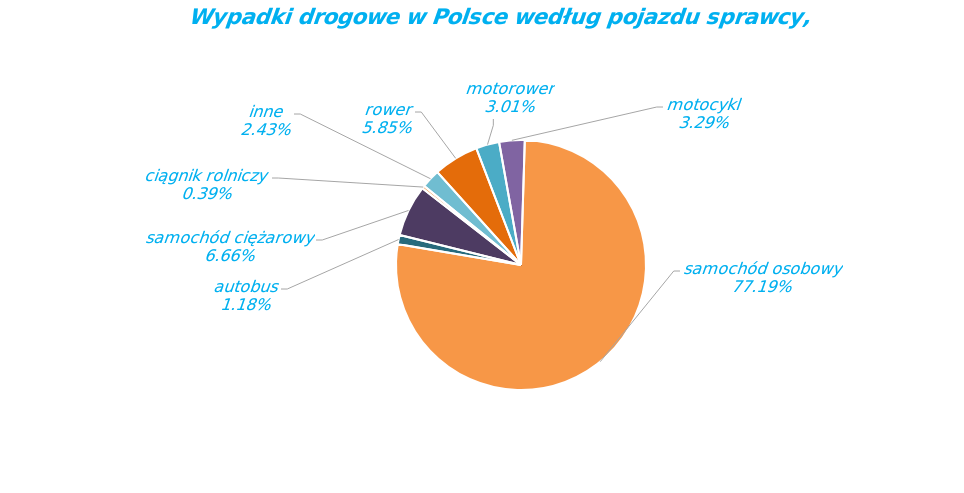
| Category | Series 0 |
|---|---|
| rower | 1716 |
| motorower | 884 |
| motocykl | 967 |
| samochód osobowy | 22659 |
| autobus | 347 |
| samochód ciężarowy | 1954 |
| ciągnik rolniczy | 114 |
| inne | 713 |